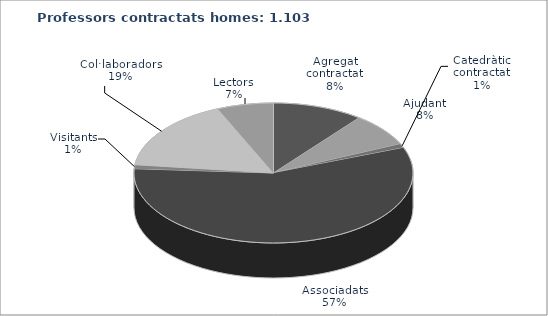
| Category | Agregada/at contractada/at Ajudant/a Catedràtic/a contractat Associades/ats Visitants Col·laboradores/ors  Lectors |
|---|---|
| Agregada/at contractada/at | 116 |
| Ajudant/a | 85 |
| Catedràtic/a contractat | 10 |
| Associades/ats | 627 |
| Visitants | 10 |
| Col·laboradores/ors  | 183 |
| Lectors | 72 |